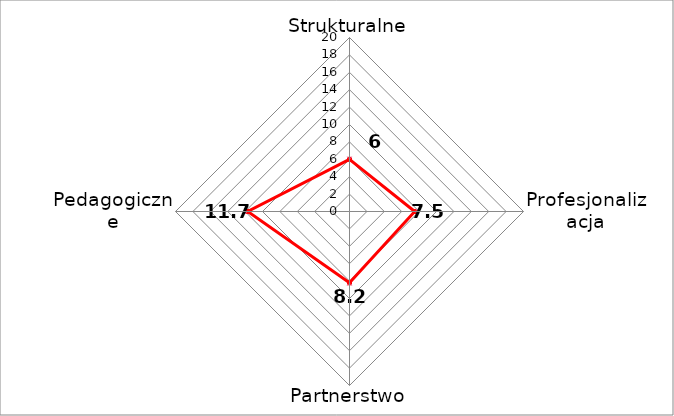
| Category | Series 0 |
|---|---|
| Strukturalne | 6 |
| Profesjonalizacja | 7.5 |
| Partnerstwo | 8.2 |
| Pedagogiczne | 11.7 |